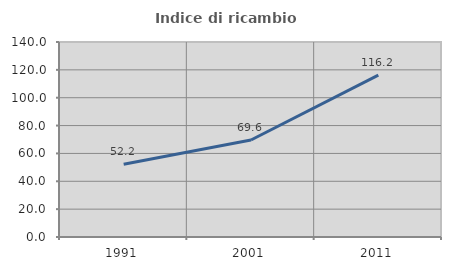
| Category | Indice di ricambio occupazionale  |
|---|---|
| 1991.0 | 52.174 |
| 2001.0 | 69.643 |
| 2011.0 | 116.197 |